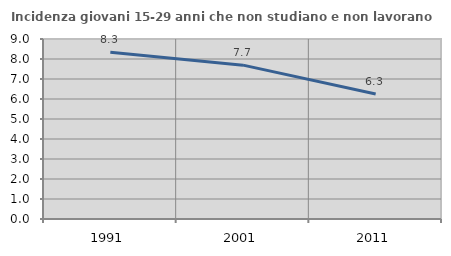
| Category | Incidenza giovani 15-29 anni che non studiano e non lavorano  |
|---|---|
| 1991.0 | 8.333 |
| 2001.0 | 7.692 |
| 2011.0 | 6.25 |